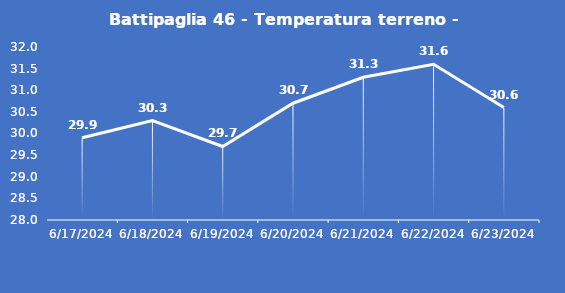
| Category | Battipaglia 46 - Temperatura terreno - Max (°C) |
|---|---|
| 6/17/24 | 29.9 |
| 6/18/24 | 30.3 |
| 6/19/24 | 29.7 |
| 6/20/24 | 30.7 |
| 6/21/24 | 31.3 |
| 6/22/24 | 31.6 |
| 6/23/24 | 30.6 |